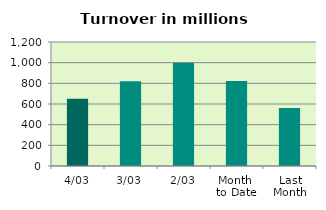
| Category | Series 0 |
|---|---|
| 4/03 | 650.477 |
| 3/03 | 819.227 |
| 2/03 | 1000.37 |
| Month 
to Date | 823.358 |
| Last
Month | 561.452 |